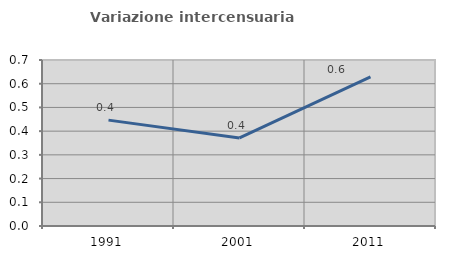
| Category | Variazione intercensuaria annua |
|---|---|
| 1991.0 | 0.447 |
| 2001.0 | 0.371 |
| 2011.0 | 0.629 |